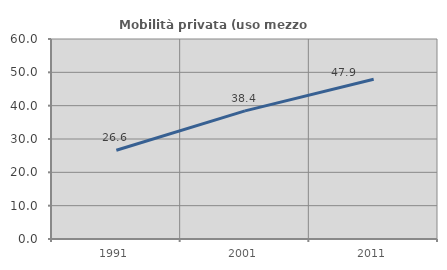
| Category | Mobilità privata (uso mezzo privato) |
|---|---|
| 1991.0 | 26.639 |
| 2001.0 | 38.431 |
| 2011.0 | 47.907 |